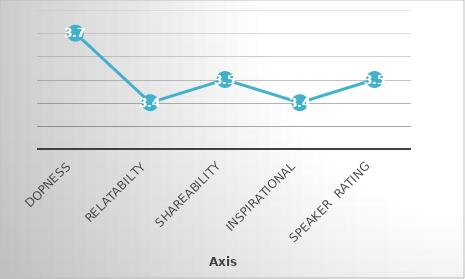
| Category | Series 0 |
|---|---|
| Dopness | 3.7 |
| Relatabilty | 3.4 |
| Shareability | 3.5 |
| Inspirational | 3.4 |
| Speaker  Rating | 3.5 |